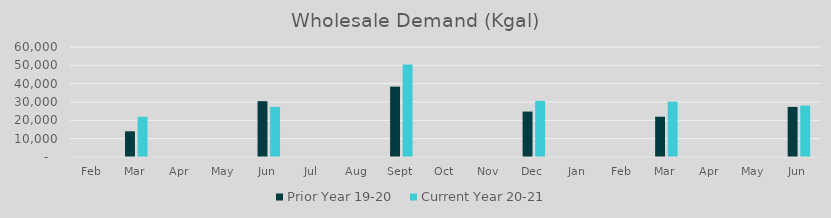
| Category | Prior Year 19-20  | Current Year 20-21 |
|---|---|---|
| Feb | 0 | 0 |
| Mar | 14013.78 | 21965.02 |
| Apr | 0 | 0 |
| May | 0 | 0 |
| Jun | 30443.6 | 27331 |
| Jul | 0 | 0 |
| Aug | 0 | 0 |
| Sep | 38376.14 | 50400.24 |
| Oct | 0 | 0 |
| Nov | 0 | 0 |
| Dec | 24784.98 | 30611.9 |
| Jan | 0 | 0 |
| Feb | 0 | 0 |
| Mar | 21965.02 | 30196.76 |
| Apr | 0 | 0 |
| May | 0 | 0 |
| Jun | 27331 | 27993.9 |